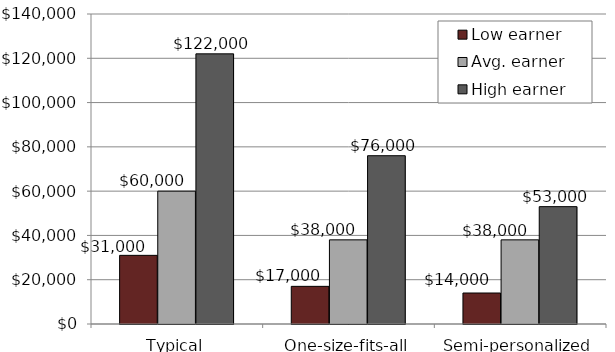
| Category | Low earner | Avg. earner | High earner |
|---|---|---|---|
| Typical | 31000 | 60000 | 122000 |
| One-size-fits-all | 17000 | 38000 | 76000 |
| Semi-personalized | 14000 | 38000 | 53000 |